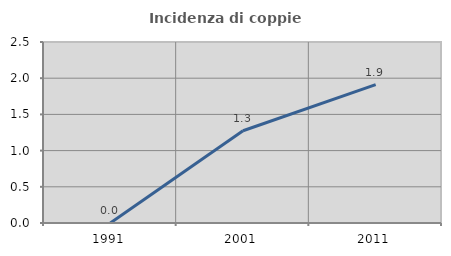
| Category | Incidenza di coppie miste |
|---|---|
| 1991.0 | 0 |
| 2001.0 | 1.274 |
| 2011.0 | 1.911 |